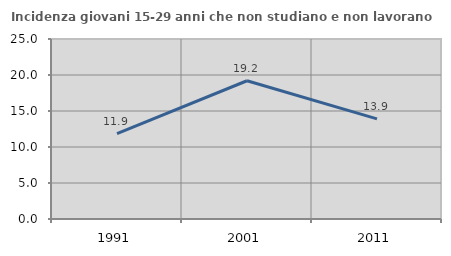
| Category | Incidenza giovani 15-29 anni che non studiano e non lavorano  |
|---|---|
| 1991.0 | 11.867 |
| 2001.0 | 19.2 |
| 2011.0 | 13.913 |